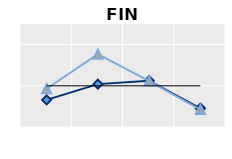
| Category | Foreign-born | Native-born | Series 1 |
|---|---|---|---|
| 25-54 | 0.658 | 0.929 | 1 |
| 55-64 | 1.041 | 1.767 | 1 |
| 65+ | 1.123 | 1.116 | 1 |